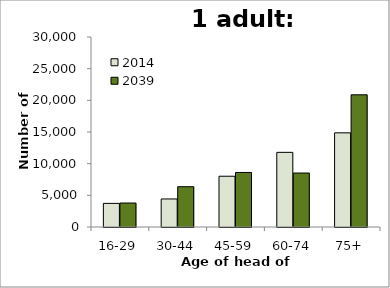
| Category | 2014 | 2039 |
|---|---|---|
| 16-29 | 3728 | 3787 |
| 30-44 | 4427 | 6362 |
| 45-59 | 8017 | 8612 |
| 60-74 | 11787 | 8520 |
| 75+ | 14867 | 20873 |